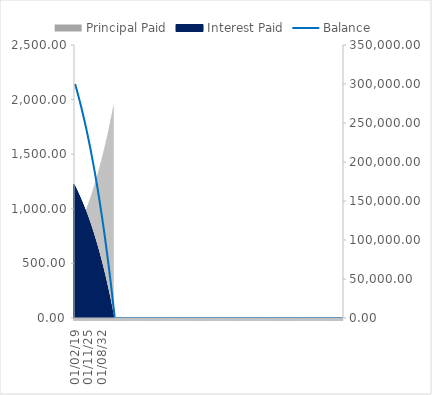
| Category | Principal Paid | Interest Paid |
|---|---|---|
| 01/02/19 | 739.272 | 1222.237 |
| 01/03/19 | 742.284 | 1219.225 |
| 01/04/19 | 745.308 | 1216.201 |
| 01/05/19 | 748.345 | 1213.165 |
| 01/06/19 | 751.394 | 1210.116 |
| 01/07/19 | 754.455 | 1207.054 |
| 01/08/19 | 757.529 | 1203.981 |
| 01/09/19 | 760.615 | 1200.894 |
| 01/10/19 | 763.714 | 1197.796 |
| 01/11/19 | 766.825 | 1194.684 |
| 01/12/19 | 769.949 | 1191.56 |
| 01/01/20 | 773.086 | 1188.423 |
| 01/02/20 | 776.236 | 1185.274 |
| 01/03/20 | 779.398 | 1182.111 |
| 01/04/20 | 782.574 | 1178.936 |
| 01/05/20 | 785.762 | 1175.747 |
| 01/06/20 | 788.963 | 1172.546 |
| 01/07/20 | 792.178 | 1169.332 |
| 01/08/20 | 795.405 | 1166.104 |
| 01/09/20 | 798.646 | 1162.864 |
| 01/10/20 | 801.899 | 1159.61 |
| 01/11/20 | 805.166 | 1156.343 |
| 01/12/20 | 808.447 | 1153.063 |
| 01/01/21 | 811.741 | 1149.769 |
| 01/02/21 | 815.048 | 1146.462 |
| 01/03/21 | 818.368 | 1143.141 |
| 01/04/21 | 821.702 | 1139.807 |
| 01/05/21 | 825.05 | 1136.459 |
| 01/06/21 | 828.411 | 1133.098 |
| 01/07/21 | 831.787 | 1129.723 |
| 01/08/21 | 835.175 | 1126.334 |
| 01/09/21 | 838.578 | 1122.931 |
| 01/10/21 | 841.994 | 1119.515 |
| 01/11/21 | 845.425 | 1116.085 |
| 01/12/21 | 848.869 | 1112.64 |
| 01/01/22 | 852.328 | 1109.182 |
| 01/02/22 | 855.8 | 1105.709 |
| 01/03/22 | 859.287 | 1102.223 |
| 01/04/22 | 862.788 | 1098.722 |
| 01/05/22 | 866.303 | 1095.207 |
| 01/06/22 | 869.832 | 1091.677 |
| 01/07/22 | 873.376 | 1088.134 |
| 01/08/22 | 876.934 | 1084.575 |
| 01/09/22 | 880.507 | 1081.003 |
| 01/10/22 | 884.094 | 1077.415 |
| 01/11/22 | 887.696 | 1073.813 |
| 01/12/22 | 891.313 | 1070.197 |
| 01/01/23 | 894.944 | 1066.565 |
| 01/02/23 | 898.59 | 1062.919 |
| 01/03/23 | 902.251 | 1059.258 |
| 01/04/23 | 905.927 | 1055.582 |
| 01/05/23 | 909.618 | 1051.892 |
| 01/06/23 | 913.324 | 1048.186 |
| 01/07/23 | 917.045 | 1044.465 |
| 01/08/23 | 920.781 | 1040.729 |
| 01/09/23 | 924.532 | 1036.977 |
| 01/10/23 | 928.299 | 1033.211 |
| 01/11/23 | 932.081 | 1029.429 |
| 01/12/23 | 935.878 | 1025.631 |
| 01/01/24 | 939.691 | 1021.818 |
| 01/02/24 | 943.52 | 1017.99 |
| 01/03/24 | 947.364 | 1014.146 |
| 01/04/24 | 951.223 | 1010.286 |
| 01/05/24 | 955.099 | 1006.411 |
| 01/06/24 | 958.99 | 1002.52 |
| 01/07/24 | 962.897 | 998.613 |
| 01/08/24 | 966.82 | 994.69 |
| 01/09/24 | 970.759 | 990.751 |
| 01/10/24 | 974.714 | 986.796 |
| 01/11/24 | 978.685 | 982.825 |
| 01/12/24 | 982.672 | 978.837 |
| 01/01/25 | 986.676 | 974.834 |
| 01/02/25 | 990.696 | 970.814 |
| 01/03/25 | 994.732 | 966.778 |
| 01/04/25 | 998.784 | 962.725 |
| 01/05/25 | 1002.854 | 958.656 |
| 01/06/25 | 1006.939 | 954.57 |
| 01/07/25 | 1011.042 | 950.468 |
| 01/08/25 | 1015.161 | 946.349 |
| 01/09/25 | 1019.297 | 942.213 |
| 01/10/25 | 1023.449 | 938.06 |
| 01/11/25 | 1027.619 | 933.89 |
| 01/12/25 | 1031.806 | 929.704 |
| 01/01/26 | 1036.009 | 925.5 |
| 01/02/26 | 1040.23 | 921.279 |
| 01/03/26 | 1044.468 | 917.041 |
| 01/04/26 | 1048.724 | 912.786 |
| 01/05/26 | 1052.996 | 908.513 |
| 01/06/26 | 1057.286 | 904.223 |
| 01/07/26 | 1061.594 | 899.916 |
| 01/08/26 | 1065.919 | 895.591 |
| 01/09/26 | 1070.262 | 891.248 |
| 01/10/26 | 1074.622 | 886.887 |
| 01/11/26 | 1079 | 882.509 |
| 01/12/26 | 1083.396 | 878.113 |
| 01/01/27 | 1087.81 | 873.699 |
| 01/02/27 | 1092.242 | 869.268 |
| 01/03/27 | 1096.692 | 864.818 |
| 01/04/27 | 1101.16 | 860.35 |
| 01/05/27 | 1105.646 | 855.863 |
| 01/06/27 | 1110.151 | 851.359 |
| 01/07/27 | 1114.674 | 846.836 |
| 01/08/27 | 1119.215 | 842.295 |
| 01/09/27 | 1123.775 | 837.735 |
| 01/10/27 | 1128.353 | 833.156 |
| 01/11/27 | 1132.95 | 828.559 |
| 01/12/27 | 1137.566 | 823.944 |
| 01/01/28 | 1142.2 | 819.309 |
| 01/02/28 | 1146.854 | 814.655 |
| 01/03/28 | 1151.526 | 809.983 |
| 01/04/28 | 1156.218 | 805.292 |
| 01/05/28 | 1160.928 | 800.581 |
| 01/06/28 | 1165.658 | 795.851 |
| 01/07/28 | 1170.407 | 791.102 |
| 01/08/28 | 1175.176 | 786.334 |
| 01/09/28 | 1179.963 | 781.546 |
| 01/10/28 | 1184.771 | 776.739 |
| 01/11/28 | 1189.598 | 771.912 |
| 01/12/28 | 1194.444 | 767.065 |
| 01/01/29 | 1199.31 | 762.199 |
| 01/02/29 | 1204.197 | 757.313 |
| 01/03/29 | 1209.103 | 752.407 |
| 01/04/29 | 1214.029 | 747.481 |
| 01/05/29 | 1218.975 | 742.535 |
| 01/06/29 | 1223.941 | 737.568 |
| 01/07/29 | 1228.928 | 732.582 |
| 01/08/29 | 1233.934 | 727.575 |
| 01/09/29 | 1238.962 | 722.548 |
| 01/10/29 | 1244.009 | 717.5 |
| 01/11/29 | 1249.077 | 712.432 |
| 01/12/29 | 1254.166 | 707.343 |
| 01/01/30 | 1259.276 | 702.233 |
| 01/02/30 | 1264.406 | 697.103 |
| 01/03/30 | 1269.558 | 691.952 |
| 01/04/30 | 1274.73 | 686.779 |
| 01/05/30 | 1279.924 | 681.586 |
| 01/06/30 | 1285.138 | 676.371 |
| 01/07/30 | 1290.374 | 671.135 |
| 01/08/30 | 1295.631 | 665.878 |
| 01/09/30 | 1300.91 | 660.6 |
| 01/10/30 | 1306.21 | 655.3 |
| 01/11/30 | 1311.531 | 649.978 |
| 01/12/30 | 1316.875 | 644.635 |
| 01/01/31 | 1322.24 | 639.27 |
| 01/02/31 | 1327.627 | 633.883 |
| 01/03/31 | 1333.036 | 628.474 |
| 01/04/31 | 1338.467 | 623.043 |
| 01/05/31 | 1343.92 | 617.59 |
| 01/06/31 | 1349.395 | 612.114 |
| 01/07/31 | 1354.893 | 606.617 |
| 01/08/31 | 1360.413 | 601.097 |
| 01/09/31 | 1365.955 | 595.554 |
| 01/10/31 | 1371.52 | 589.989 |
| 01/11/31 | 1377.108 | 584.401 |
| 01/12/31 | 1382.718 | 578.791 |
| 01/01/32 | 1388.352 | 573.158 |
| 01/02/32 | 1394.008 | 567.501 |
| 01/03/32 | 1399.687 | 561.822 |
| 01/04/32 | 1405.39 | 556.119 |
| 01/05/32 | 1411.116 | 550.394 |
| 01/06/32 | 1416.865 | 544.645 |
| 01/07/32 | 1422.637 | 538.872 |
| 01/08/32 | 1428.433 | 533.076 |
| 01/09/32 | 1434.253 | 527.257 |
| 01/10/32 | 1440.096 | 521.413 |
| 01/11/32 | 1445.963 | 515.546 |
| 01/12/32 | 1451.854 | 509.655 |
| 01/01/33 | 1457.769 | 503.74 |
| 01/02/33 | 1463.709 | 497.801 |
| 01/03/33 | 1469.672 | 491.838 |
| 01/04/33 | 1475.659 | 485.85 |
| 01/05/33 | 1481.671 | 479.838 |
| 01/06/33 | 1487.708 | 473.801 |
| 01/07/33 | 1493.769 | 467.74 |
| 01/08/33 | 1499.855 | 461.654 |
| 01/09/33 | 1505.966 | 455.544 |
| 01/10/33 | 1512.101 | 449.408 |
| 01/11/33 | 1518.261 | 443.248 |
| 01/12/33 | 1524.447 | 437.062 |
| 01/01/34 | 1530.658 | 430.852 |
| 01/02/34 | 1536.894 | 424.615 |
| 01/03/34 | 1543.155 | 418.354 |
| 01/04/34 | 1549.442 | 412.067 |
| 01/05/34 | 1555.755 | 405.754 |
| 01/06/34 | 1562.093 | 399.416 |
| 01/07/34 | 1568.458 | 393.052 |
| 01/08/34 | 1574.848 | 386.662 |
| 01/09/34 | 1581.264 | 380.246 |
| 01/10/34 | 1587.706 | 373.803 |
| 01/11/34 | 1594.175 | 367.335 |
| 01/12/34 | 1600.669 | 360.84 |
| 01/01/35 | 1607.191 | 354.319 |
| 01/02/35 | 1613.739 | 347.771 |
| 01/03/35 | 1620.313 | 341.196 |
| 01/04/35 | 1626.915 | 334.595 |
| 01/05/35 | 1633.543 | 327.967 |
| 01/06/35 | 1640.198 | 321.311 |
| 01/07/35 | 1646.88 | 314.629 |
| 01/08/35 | 1653.59 | 307.919 |
| 01/09/35 | 1660.327 | 301.182 |
| 01/10/35 | 1667.091 | 294.418 |
| 01/11/35 | 1673.883 | 287.626 |
| 01/12/35 | 1680.703 | 280.807 |
| 01/01/36 | 1687.55 | 273.959 |
| 01/02/36 | 1694.426 | 267.084 |
| 01/03/36 | 1701.329 | 260.181 |
| 01/04/36 | 1708.26 | 253.249 |
| 01/05/36 | 1715.22 | 246.289 |
| 01/06/36 | 1722.208 | 239.301 |
| 01/07/36 | 1729.224 | 232.285 |
| 01/08/36 | 1736.27 | 225.24 |
| 01/09/36 | 1743.343 | 218.166 |
| 01/10/36 | 1750.446 | 211.063 |
| 01/11/36 | 1757.577 | 203.932 |
| 01/12/36 | 1764.738 | 196.771 |
| 01/01/37 | 1771.928 | 189.582 |
| 01/02/37 | 1779.147 | 182.363 |
| 01/03/37 | 1786.395 | 175.114 |
| 01/04/37 | 1793.673 | 167.836 |
| 01/05/37 | 1800.981 | 160.528 |
| 01/06/37 | 1808.318 | 153.191 |
| 01/07/37 | 1815.686 | 145.824 |
| 01/08/37 | 1823.083 | 138.426 |
| 01/09/37 | 1830.51 | 130.999 |
| 01/10/37 | 1837.968 | 123.541 |
| 01/11/37 | 1845.456 | 116.053 |
| 01/12/37 | 1852.975 | 108.534 |
| 01/01/38 | 1860.524 | 100.985 |
| 01/02/38 | 1868.104 | 93.405 |
| 01/03/38 | 1875.715 | 85.794 |
| 01/04/38 | 1883.357 | 78.152 |
| 01/05/38 | 1891.03 | 70.479 |
| 01/06/38 | 1898.734 | 62.775 |
| 01/07/38 | 1906.47 | 55.039 |
| 01/08/38 | 1914.237 | 47.272 |
| 01/09/38 | 1922.036 | 39.473 |
| 01/10/38 | 1929.867 | 31.643 |
| 01/11/38 | 1937.729 | 23.78 |
| 01/12/38 | 1945.624 | 15.886 |
| 01/01/39 | 1953.55 | 7.959 |